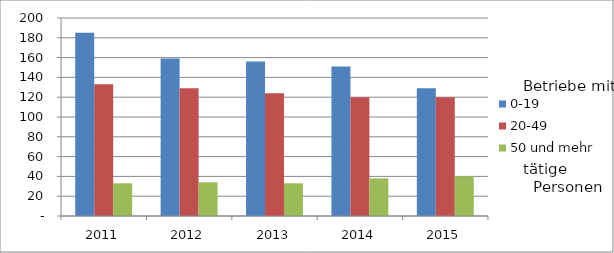
| Category | 0-19 | 20-49 | 50 und mehr |
|---|---|---|---|
| 2011.0 | 185 | 133 | 33 |
| 2012.0 | 159 | 129 | 34 |
| 2013.0 | 156 | 124 | 33 |
| 2014.0 | 151 | 120 | 38 |
| 2015.0 | 129 | 120 | 40 |